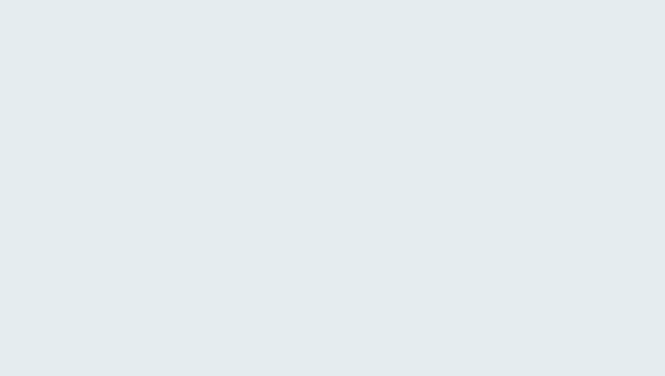
| Category | Series 0 |
|---|---|
| DPP3 capex 
allowance 
(nominal) | 3893.294 |
| DPP4 capex 
allowance 
(nominal) | 6300.451 |
| AMP24 forecast
 (nominal) | 7627.321 |